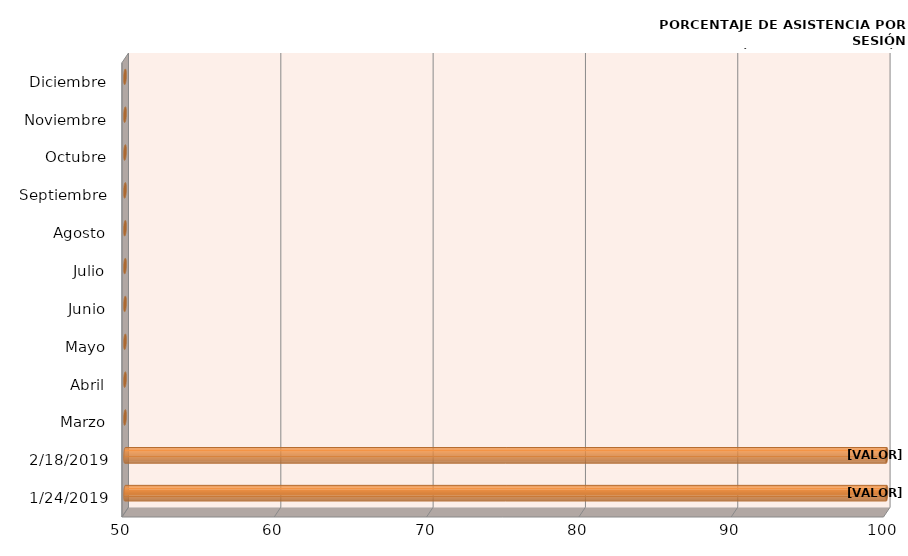
| Category | Series 0 |
|---|---|
| 24/01/2019 | 100 |
| 18/02/2019 | 100 |
| Marzo | 0 |
| Abril | 0 |
| Mayo | 0 |
| Junio | 0 |
| Julio | 0 |
| Agosto | 0 |
| Septiembre | 0 |
| Octubre | 0 |
| Noviembre | 0 |
| Diciembre | 0 |